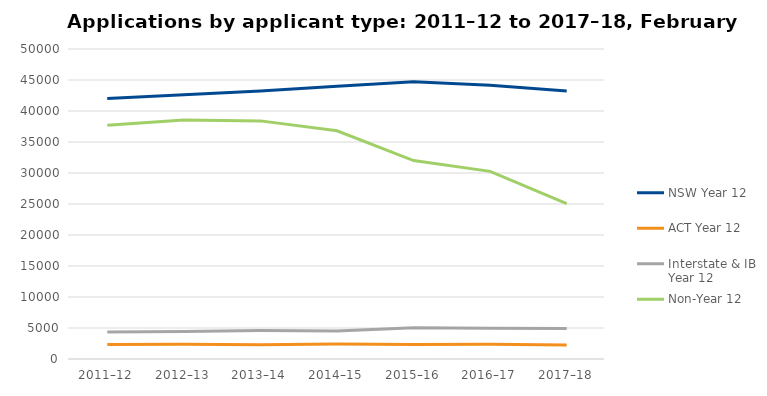
| Category | NSW Year 12 | ACT Year 12 | Interstate & IB Year 12 | Non-Year 12 |
|---|---|---|---|---|
| 2011–12 | 42032 | 2334 | 4341 | 37691 |
| 2012–13 | 42638 | 2361 | 4441 | 38557 |
| 2013–14 | 43227 | 2315 | 4590 | 38406 |
| 2014–15 | 43996 | 2417 | 4534 | 36809 |
| 2015–16 | 44732 | 2337 | 5033 | 32000 |
| 2016–17 | 44164 | 2381 | 4961 | 30266 |
| 2017–18 | 43228 | 2268 | 4926 | 25050 |